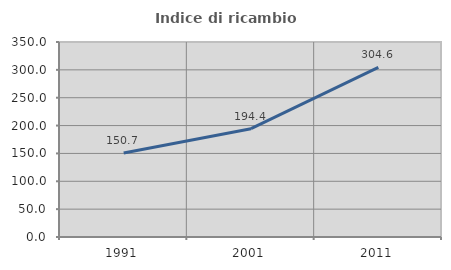
| Category | Indice di ricambio occupazionale  |
|---|---|
| 1991.0 | 150.718 |
| 2001.0 | 194.444 |
| 2011.0 | 304.615 |